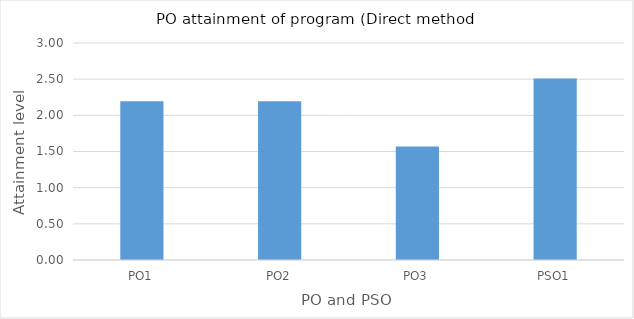
| Category | Series 0 |
|---|---|
| PO1 | 2.195 |
| PO2 | 2.195 |
| PO3 | 1.568 |
| PSO1 | 2.509 |